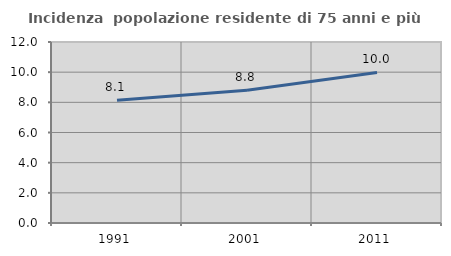
| Category | Incidenza  popolazione residente di 75 anni e più |
|---|---|
| 1991.0 | 8.135 |
| 2001.0 | 8.796 |
| 2011.0 | 9.985 |